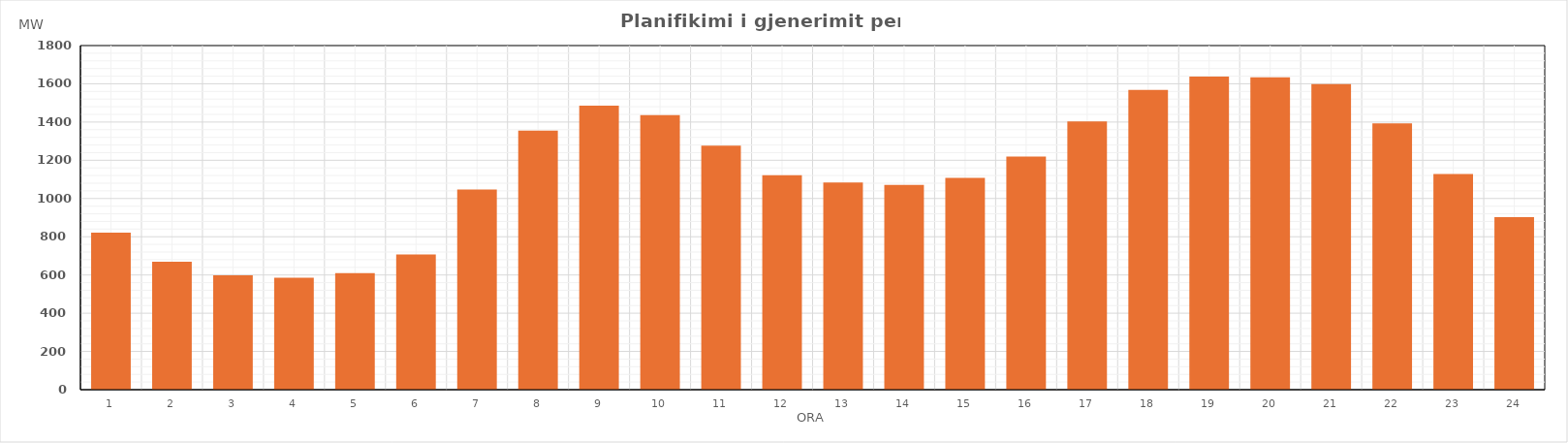
| Category | Max (MW) |
|---|---|
| 0 | 821.97 |
| 1 | 668.69 |
| 2 | 598.54 |
| 3 | 585.8 |
| 4 | 609.64 |
| 5 | 707.77 |
| 6 | 1047.38 |
| 7 | 1354.84 |
| 8 | 1485.39 |
| 9 | 1436.64 |
| 10 | 1277.07 |
| 11 | 1121.55 |
| 12 | 1083.8 |
| 13 | 1070.77 |
| 14 | 1107.51 |
| 15 | 1219.53 |
| 16 | 1403.68 |
| 17 | 1568.49 |
| 18 | 1637.14 |
| 19 | 1633.84 |
| 20 | 1598.81 |
| 21 | 1393.54 |
| 22 | 1128.08 |
| 23 | 902.05 |